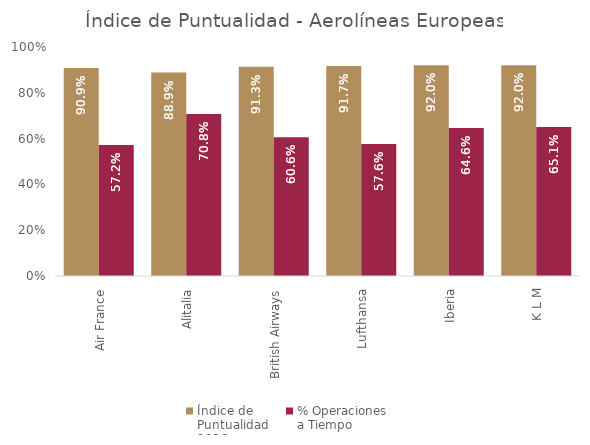
| Category | Índice de 
Puntualidad
2019 | % Operaciones 
a Tiempo |
|---|---|---|
| Air France | 0.909 | 0.572 |
| Alitalia | 0.889 | 0.708 |
| British Airways | 0.913 | 0.606 |
| Lufthansa | 0.917 | 0.576 |
| Iberia | 0.92 | 0.646 |
| K L M | 0.92 | 0.651 |